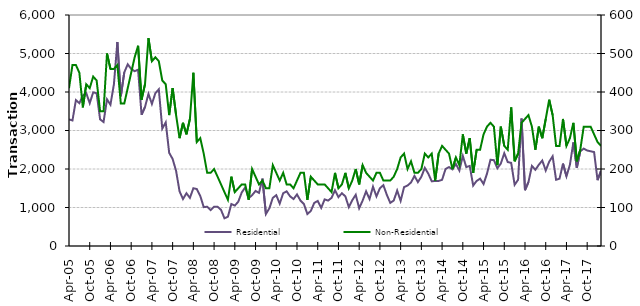
| Category | Residential |
|---|---|
| 2005-04-01 | 3290 |
| 2005-05-01 | 3260 |
| 2005-06-01 | 3790 |
| 2005-07-01 | 3710 |
| 2005-08-01 | 3910 |
| 2005-09-01 | 3970 |
| 2005-10-01 | 3710 |
| 2005-11-01 | 3990 |
| 2005-12-01 | 3970 |
| 2006-01-01 | 3290 |
| 2006-02-01 | 3220 |
| 2006-03-01 | 3810 |
| 2006-04-01 | 3670 |
| 2006-05-01 | 4200 |
| 2006-06-01 | 5300 |
| 2006-07-01 | 3890 |
| 2006-08-01 | 4510 |
| 2006-09-01 | 4720 |
| 2006-10-01 | 4600 |
| 2006-11-01 | 4540 |
| 2006-12-01 | 4580 |
| 2007-01-01 | 3410 |
| 2007-02-01 | 3610 |
| 2007-03-01 | 3950 |
| 2007-04-01 | 3690 |
| 2007-05-01 | 3970 |
| 2007-06-01 | 4070 |
| 2007-07-01 | 3050 |
| 2007-08-01 | 3210 |
| 2007-09-01 | 2420 |
| 2007-10-01 | 2260 |
| 2007-11-01 | 1950 |
| 2007-12-01 | 1420 |
| 2008-01-01 | 1220 |
| 2008-02-01 | 1370 |
| 2008-03-01 | 1250 |
| 2008-04-01 | 1500 |
| 2008-05-01 | 1480 |
| 2008-06-01 | 1300 |
| 2008-07-01 | 1010 |
| 2008-08-01 | 1020 |
| 2008-09-01 | 930 |
| 2008-10-01 | 1020 |
| 2008-11-01 | 1020 |
| 2008-12-01 | 940 |
| 2009-01-01 | 720 |
| 2009-02-01 | 760 |
| 2009-03-01 | 1090 |
| 2009-04-01 | 1050 |
| 2009-05-01 | 1150 |
| 2009-06-01 | 1390 |
| 2009-07-01 | 1520 |
| 2009-08-01 | 1240 |
| 2009-09-01 | 1320 |
| 2009-10-01 | 1430 |
| 2009-11-01 | 1380 |
| 2009-12-01 | 1750 |
| 2010-01-01 | 830 |
| 2010-02-01 | 980 |
| 2010-03-01 | 1250 |
| 2010-04-01 | 1320 |
| 2010-05-01 | 1100 |
| 2010-06-01 | 1370 |
| 2010-07-01 | 1420 |
| 2010-08-01 | 1290 |
| 2010-09-01 | 1220 |
| 2010-10-01 | 1340 |
| 2010-11-01 | 1180 |
| 2010-12-01 | 1090 |
| 2011-01-01 | 830 |
| 2011-02-01 | 910 |
| 2011-03-01 | 1120 |
| 2011-04-01 | 1170 |
| 2011-05-01 | 990 |
| 2011-06-01 | 1210 |
| 2011-07-01 | 1180 |
| 2011-08-01 | 1250 |
| 2011-09-01 | 1450 |
| 2011-10-01 | 1270 |
| 2011-11-01 | 1370 |
| 2011-12-01 | 1290 |
| 2012-01-01 | 1010 |
| 2012-02-01 | 1190 |
| 2012-03-01 | 1330 |
| 2012-04-01 | 980 |
| 2012-05-01 | 1180 |
| 2012-06-01 | 1420 |
| 2012-07-01 | 1220 |
| 2012-08-01 | 1540 |
| 2012-09-01 | 1290 |
| 2012-10-01 | 1500 |
| 2012-11-01 | 1580 |
| 2012-12-01 | 1330 |
| 2013-01-01 | 1120 |
| 2013-02-01 | 1180 |
| 2013-03-01 | 1440 |
| 2013-04-01 | 1170 |
| 2013-05-01 | 1530 |
| 2013-06-01 | 1570 |
| 2013-07-01 | 1650 |
| 2013-08-01 | 1820 |
| 2013-09-01 | 1660 |
| 2013-10-01 | 1800 |
| 2013-11-01 | 2030 |
| 2013-12-01 | 1880 |
| 2014-01-01 | 1680 |
| 2014-02-01 | 1690 |
| 2014-03-01 | 1690 |
| 2014-04-01 | 1720 |
| 2014-05-01 | 2000 |
| 2014-06-01 | 2050 |
| 2014-07-01 | 1990 |
| 2014-08-01 | 2130 |
| 2014-09-01 | 1960 |
| 2014-10-01 | 2340 |
| 2014-11-01 | 2050 |
| 2014-12-01 | 2080 |
| 2015-01-01 | 1570 |
| 2015-02-01 | 1690 |
| 2015-03-01 | 1750 |
| 2015-04-01 | 1610 |
| 2015-05-01 | 1880 |
| 2015-06-01 | 2240 |
| 2015-07-01 | 2230 |
| 2015-08-01 | 2020 |
| 2015-09-01 | 2140 |
| 2015-10-01 | 2410 |
| 2015-11-01 | 2180 |
| 2015-12-01 | 2160 |
| 2016-01-01 | 1590 |
| 2016-02-01 | 1720 |
| 2016-03-01 | 3310 |
| 2016-04-01 | 1450 |
| 2016-05-01 | 1660 |
| 2016-06-01 | 2080 |
| 2016-07-01 | 1980 |
| 2016-08-01 | 2110 |
| 2016-09-01 | 2220 |
| 2016-10-01 | 1960 |
| 2016-11-01 | 2190 |
| 2016-12-01 | 2330 |
| 2017-01-01 | 1720 |
| 2017-02-01 | 1750 |
| 2017-03-01 | 2140 |
| 2017-04-01 | 1810 |
| 2017-05-01 | 2110 |
| 2017-06-01 | 2690 |
| 2017-07-01 | 2030 |
| 2017-08-01 | 2460 |
| 2017-09-01 | 2530 |
| 2017-10-01 | 2480 |
| 2017-11-01 | 2460 |
| 2017-12-01 | 2440 |
| 2018-01-01 | 1710 |
| 2018-02-01 | 1950 |